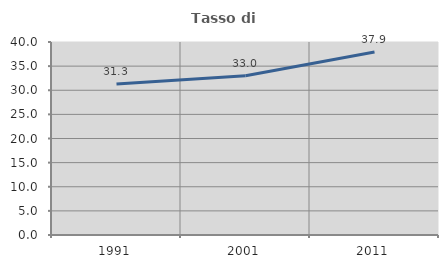
| Category | Tasso di occupazione   |
|---|---|
| 1991.0 | 31.32 |
| 2001.0 | 33 |
| 2011.0 | 37.926 |